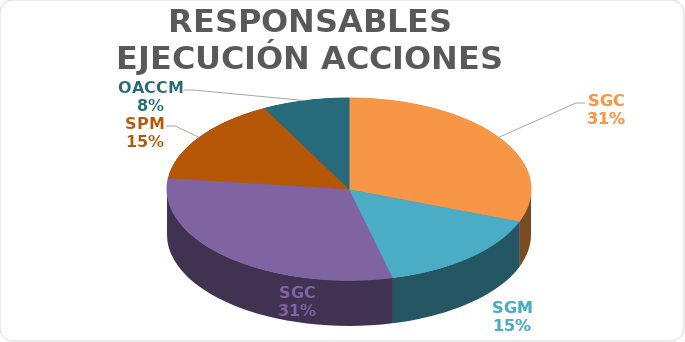
| Category | Series 0 |
|---|---|
| SGC | 4 |
| SGM | 2 |
| SGC | 4 |
| SPM | 2 |
| OACCM | 1 |